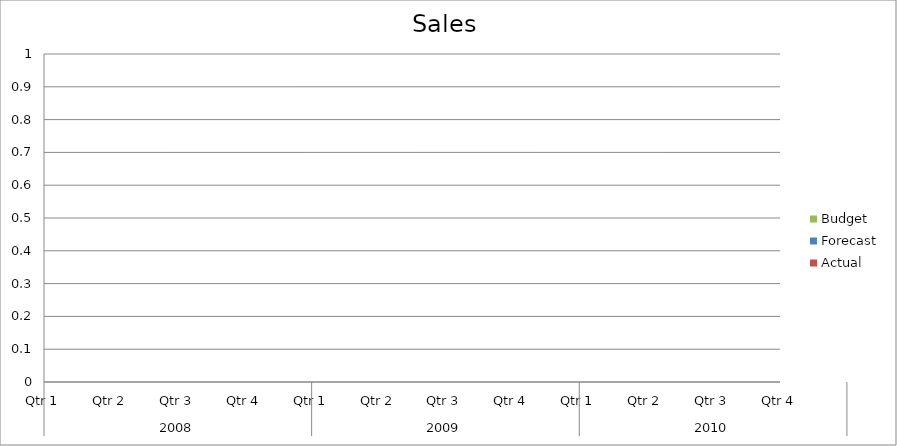
| Category | Budget | Forecast | Actual |
|---|---|---|---|
| 0 | 2540 | 2390 | 1460 |
| 1 | 1660 | 2230 | 2420 |
| 2 | 1750 | 2090 | 1300 |
| 3 | 1230 | 3270 | 3290 |
| 4 | 3150 | 730 | 850 |
| 5 | 3160 | 3110 | 960 |
| 6 | 2080 | 1760 | 700 |
| 7 | 760 | 1460 | 1330 |
| 8 | 1890 | 3130 | 1080 |
| 9 | 2750 | 1950 | 1190 |
| 10 | 2160 | 1150 | 3440 |
| 11 | 3370 | 1710 | 1120 |